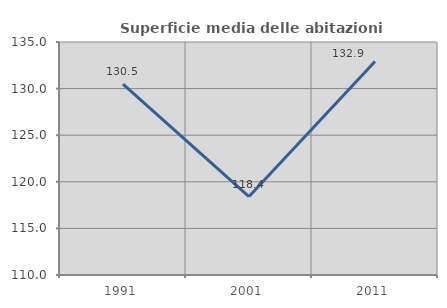
| Category | Superficie media delle abitazioni occupate |
|---|---|
| 1991.0 | 130.475 |
| 2001.0 | 118.417 |
| 2011.0 | 132.915 |